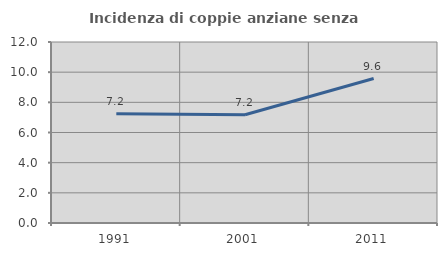
| Category | Incidenza di coppie anziane senza figli  |
|---|---|
| 1991.0 | 7.248 |
| 2001.0 | 7.177 |
| 2011.0 | 9.579 |